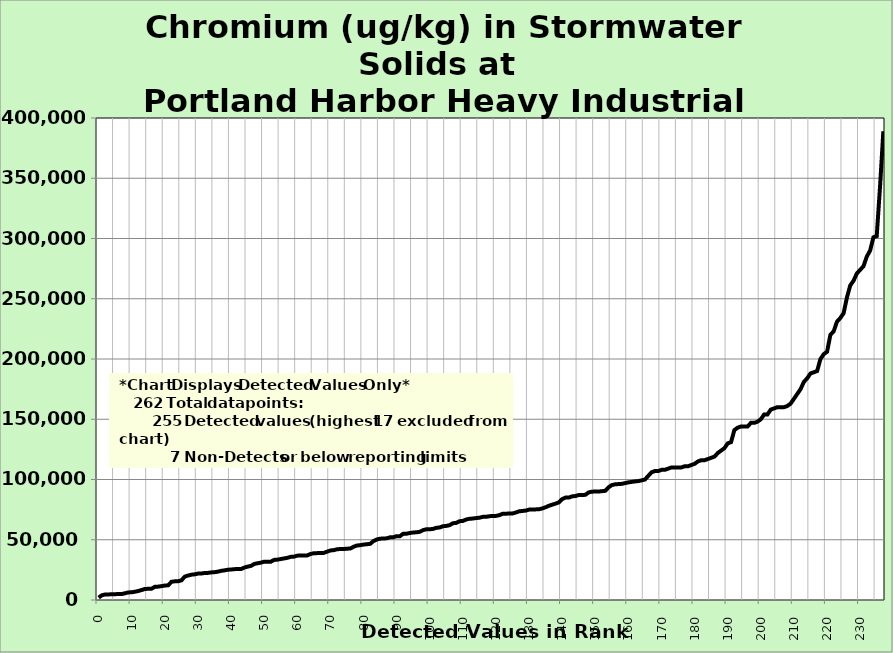
| Category | Data |
|---|---|
| 0.0 | 2000 |
| 1.0 | 3950 |
| 2.0 | 4600 |
| 3.0 | 4630 |
| 4.0 | 4770 |
| 5.0 | 4800 |
| 6.0 | 5000 |
| 7.0 | 5000 |
| 8.0 | 5600 |
| 9.0 | 6300 |
| 10.0 | 6400 |
| 11.0 | 6900 |
| 12.0 | 7500 |
| 13.0 | 8300 |
| 14.0 | 9200 |
| 15.0 | 9260 |
| 16.0 | 9390 |
| 17.0 | 11000 |
| 18.0 | 11100 |
| 19.0 | 11500 |
| 20.0 | 12000 |
| 21.0 | 12200 |
| 22.0 | 15100 |
| 23.0 | 15500 |
| 24.0 | 15600 |
| 25.0 | 16300 |
| 26.0 | 19400 |
| 27.0 | 20300 |
| 28.0 | 21000 |
| 29.0 | 21300 |
| 30.0 | 21900 |
| 31.0 | 22000 |
| 32.0 | 22400 |
| 33.0 | 22500 |
| 34.0 | 22900 |
| 35.0 | 23100 |
| 36.0 | 23500 |
| 37.0 | 24200 |
| 38.0 | 24600 |
| 39.0 | 25100 |
| 40.0 | 25300 |
| 41.0 | 25600 |
| 42.0 | 25700 |
| 43.0 | 25700 |
| 44.0 | 26900 |
| 45.0 | 27700 |
| 46.0 | 28300 |
| 47.0 | 29900 |
| 48.0 | 30500 |
| 49.0 | 31000 |
| 50.0 | 31800 |
| 51.0 | 31800 |
| 52.0 | 31800 |
| 53.0 | 33300 |
| 54.0 | 33500 |
| 55.0 | 34000 |
| 56.0 | 34500 |
| 57.0 | 35000 |
| 58.0 | 35800 |
| 59.0 | 36000 |
| 60.0 | 36800 |
| 61.0 | 37000 |
| 62.0 | 37000 |
| 63.0 | 37000 |
| 64.0 | 38200 |
| 65.0 | 38800 |
| 66.0 | 38900 |
| 67.0 | 39000 |
| 68.0 | 39100 |
| 69.0 | 40100 |
| 70.0 | 41100 |
| 71.0 | 41400 |
| 72.0 | 42100 |
| 73.0 | 42300 |
| 74.0 | 42300 |
| 75.0 | 42600 |
| 76.0 | 42700 |
| 77.0 | 44200 |
| 78.0 | 45200 |
| 79.0 | 45500 |
| 80.0 | 46000 |
| 81.0 | 46300 |
| 82.0 | 46600 |
| 83.0 | 48900 |
| 84.0 | 50200 |
| 85.0 | 50900 |
| 86.0 | 51000 |
| 87.0 | 51200 |
| 88.0 | 52000 |
| 89.0 | 52100 |
| 90.0 | 53000 |
| 91.0 | 53000 |
| 92.0 | 55000 |
| 93.0 | 55000 |
| 94.0 | 55600 |
| 95.0 | 56000 |
| 96.0 | 56200 |
| 97.0 | 56600 |
| 98.0 | 58000 |
| 99.0 | 58700 |
| 100.0 | 58700 |
| 101.0 | 59000 |
| 102.0 | 59900 |
| 103.0 | 60200 |
| 104.0 | 61200 |
| 105.0 | 61500 |
| 106.0 | 62100 |
| 107.0 | 63700 |
| 108.0 | 64000 |
| 109.0 | 65400 |
| 110.0 | 65600 |
| 111.0 | 66800 |
| 112.0 | 67400 |
| 113.0 | 67600 |
| 114.0 | 68000 |
| 115.0 | 68300 |
| 116.0 | 69000 |
| 117.0 | 69000 |
| 118.0 | 69500 |
| 119.0 | 69800 |
| 120.0 | 69800 |
| 121.0 | 70400 |
| 122.0 | 71500 |
| 123.0 | 71600 |
| 124.0 | 71800 |
| 125.0 | 71800 |
| 126.0 | 72600 |
| 127.0 | 73600 |
| 128.0 | 73900 |
| 129.0 | 74200 |
| 130.0 | 75000 |
| 131.0 | 75100 |
| 132.0 | 75200 |
| 133.0 | 75300 |
| 134.0 | 76000 |
| 135.0 | 77000 |
| 136.0 | 78200 |
| 137.0 | 79100 |
| 138.0 | 80000 |
| 139.0 | 81000 |
| 140.0 | 83700 |
| 141.0 | 85000 |
| 142.0 | 85000 |
| 143.0 | 86000 |
| 144.0 | 86300 |
| 145.0 | 87100 |
| 146.0 | 87100 |
| 147.0 | 87300 |
| 148.0 | 89300 |
| 149.0 | 89900 |
| 150.0 | 90000 |
| 151.0 | 90000 |
| 152.0 | 90300 |
| 153.0 | 90600 |
| 154.0 | 93500 |
| 155.0 | 95400 |
| 156.0 | 96000 |
| 157.0 | 96200 |
| 158.0 | 96400 |
| 159.0 | 97000 |
| 160.0 | 97600 |
| 161.0 | 98000 |
| 162.0 | 98400 |
| 163.0 | 98700 |
| 164.0 | 99300 |
| 165.0 | 100000 |
| 166.0 | 103000 |
| 167.0 | 106000 |
| 168.0 | 107000 |
| 169.0 | 107000 |
| 170.0 | 108000 |
| 171.0 | 108000 |
| 172.0 | 109000 |
| 173.0 | 110000 |
| 174.0 | 110000 |
| 175.0 | 110000 |
| 176.0 | 110000 |
| 177.0 | 111000 |
| 178.0 | 111000 |
| 179.0 | 112000 |
| 180.0 | 113000 |
| 181.0 | 115000 |
| 182.0 | 116000 |
| 183.0 | 116000 |
| 184.0 | 117000 |
| 185.0 | 118000 |
| 186.0 | 119000 |
| 187.0 | 122000 |
| 188.0 | 124000 |
| 189.0 | 126000 |
| 190.0 | 130000 |
| 191.0 | 131000 |
| 192.0 | 141000 |
| 193.0 | 143000 |
| 194.0 | 144000 |
| 195.0 | 144000 |
| 196.0 | 144000 |
| 197.0 | 147000 |
| 198.0 | 147000 |
| 199.0 | 148000 |
| 200.0 | 150000 |
| 201.0 | 154000 |
| 202.0 | 154000 |
| 203.0 | 158000 |
| 204.0 | 159000 |
| 205.0 | 160000 |
| 206.0 | 160000 |
| 207.0 | 160000 |
| 208.0 | 161000 |
| 209.0 | 163000 |
| 210.0 | 167000 |
| 211.0 | 171000 |
| 212.0 | 175000 |
| 213.0 | 181000 |
| 214.0 | 184000 |
| 215.0 | 188000 |
| 216.0 | 189000 |
| 217.0 | 190000 |
| 218.0 | 200000 |
| 219.0 | 204000 |
| 220.0 | 206000 |
| 221.0 | 220000 |
| 222.0 | 223000 |
| 223.0 | 231000 |
| 224.0 | 234000 |
| 225.0 | 238000 |
| 226.0 | 251000 |
| 227.0 | 261000 |
| 228.0 | 265000 |
| 229.0 | 271000 |
| 230.0 | 274000 |
| 231.0 | 277000 |
| 232.0 | 285000 |
| 233.0 | 290000 |
| 234.0 | 301000 |
| 235.0 | 302000 |
| 236.0 | 343000 |
| 237.0 | 389000 |